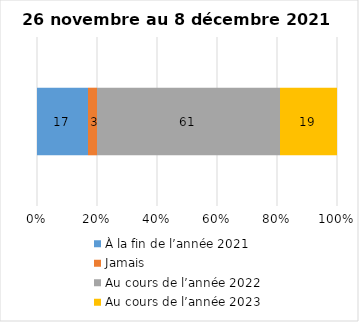
| Category | À la fin de l’année 2021 | Jamais | Au cours de l’année 2022 | Au cours de l’année 2023 |
|---|---|---|---|---|
| 0 | 17 | 3 | 61 | 19 |